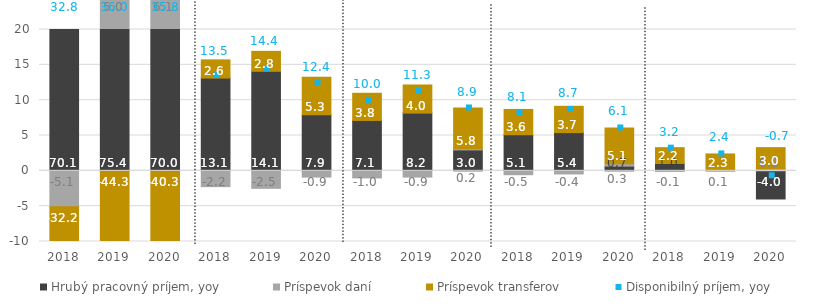
| Category | Hrubý pracovný príjem, yoy | Príspevok daní | Príspevok transferov |
|---|---|---|---|
| 2018.0 | 70.091 | -5.072 | -32.201 |
| 2019.0 | 75.397 | 4.984 | -44.339 |
| 2020.0 | 69.979 | 6.131 | -40.343 |
| 2018.0 | 13.125 | -2.238 | 2.576 |
| 2019.0 | 14.084 | -2.477 | 2.826 |
| 2020.0 | 7.95 | -0.883 | 5.308 |
| 2018.0 | 7.13 | -1 | 3.846 |
| 2019.0 | 8.167 | -0.886 | 3.984 |
| 2020.0 | 2.958 | 0.164 | 5.768 |
| 2018.0 | 5.108 | -0.547 | 3.583 |
| 2019.0 | 5.412 | -0.444 | 3.719 |
| 2020.0 | 0.662 | 0.334 | 5.068 |
| 2018.0 | 1.038 | -0.067 | 2.242 |
| 2019.0 | 0.009 | 0.05 | 2.332 |
| 2020.0 | -3.985 | 0.318 | 2.964 |